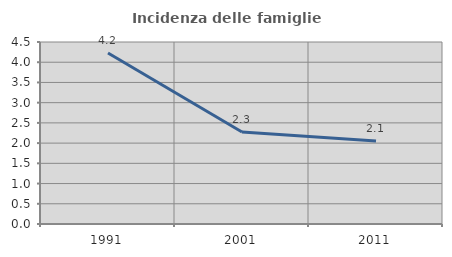
| Category | Incidenza delle famiglie numerose |
|---|---|
| 1991.0 | 4.228 |
| 2001.0 | 2.276 |
| 2011.0 | 2.055 |